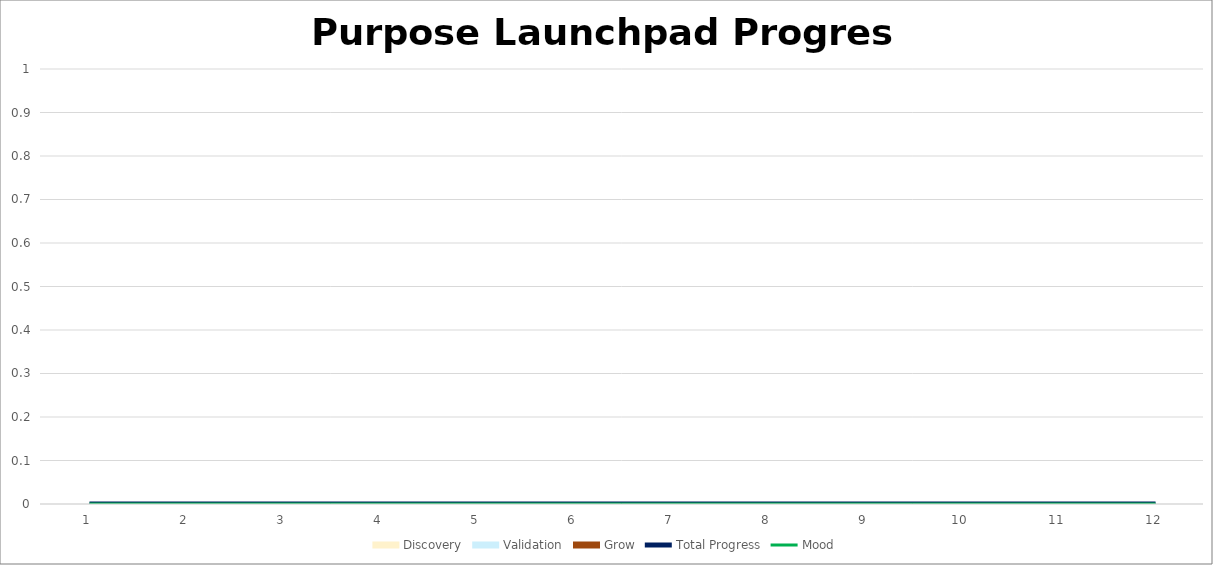
| Category | Discovery | Validation | Grow |
|---|---|---|---|
| 0 | 0 | 0 | 0 |
| 1 | 0 | 0 | 0 |
| 2 | 0 | 0 | 0 |
| 3 | 0 | 0 | 0 |
| 4 | 0 | 0 | 0 |
| 5 | 0 | 0 | 0 |
| 6 | 0 | 0 | 0 |
| 7 | 0 | 0 | 0 |
| 8 | 0 | 0 | 0 |
| 9 | 0 | 0 | 0 |
| 10 | 0 | 0 | 0 |
| 11 | 0 | 0 | 0 |